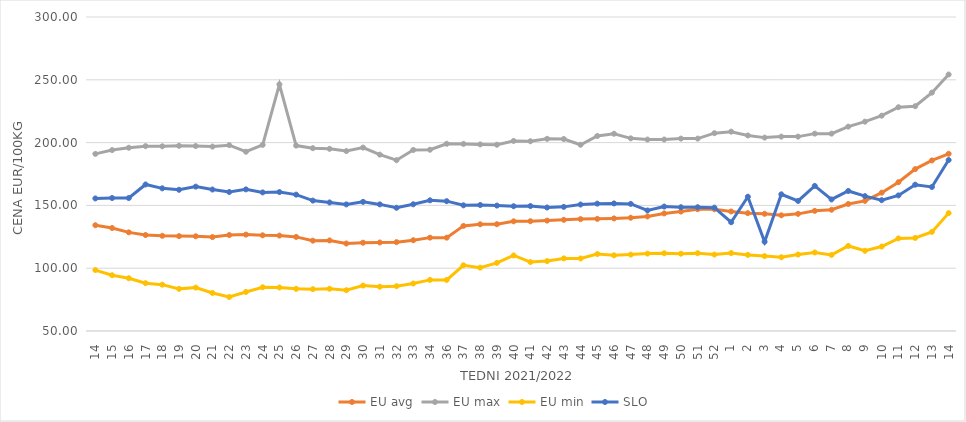
| Category | EU avg | EU max | EU min | SLO |
|---|---|---|---|---|
| 14.0 | 134.198 | 191.034 | 98.5 | 155.55 |
| 15.0 | 132.003 | 194.047 | 94.39 | 155.88 |
| 16.0 | 128.53 | 195.913 | 92.04 | 155.88 |
| 17.0 | 126.415 | 197.188 | 88.07 | 166.66 |
| 18.0 | 125.787 | 197.055 | 86.89 | 163.58 |
| 19.0 | 125.54 | 197.478 | 83.546 | 162.44 |
| 20.0 | 125.412 | 197.263 | 84.55 | 164.94 |
| 21.0 | 124.768 | 196.821 | 80.264 | 162.64 |
| 22.0 | 126.43 | 197.963 | 77.048 | 160.68 |
| 23.0 | 126.76 | 192.72 | 81.087 | 162.75 |
| 24.0 | 126.19 | 198.186 | 84.83 | 160.34 |
| 25.0 | 125.97 | 246.36 | 84.63 | 160.6 |
| 26.0 | 124.92 | 197.607 | 83.57 | 158.57 |
| 27.0 | 121.922 | 195.566 | 83.3 | 153.83 |
| 28.0 | 122.106 | 195.043 | 83.64 | 152.35 |
| 29.0 | 119.659 | 193.272 | 82.49 | 150.79 |
| 30.0 | 120.3 | 196.01 | 86.16 | 152.82 |
| 31.0 | 120.473 | 190.42 | 85.26 | 150.8 |
| 32.0 | 120.756 | 186 | 85.65 | 148.1 |
| 33.0 | 122.274 | 194.145 | 87.8 | 150.88 |
| 34.0 | 124.332 | 194.304 | 90.69 | 154.04 |
| 36.0 | 124.332 | 199.06 | 90.69 | 153.37 |
| 37.0 | 133.685 | 198.97 | 102.334 | 150.06 |
| 38.0 | 134.959 | 198.57 | 100.43 | 150.32 |
| 39.0 | 135.021 | 198.3 | 104.21 | 149.86 |
| 40.0 | 137.315 | 201.34 | 110.15 | 149.34 |
| 41.0 | 137.411 | 201.081 | 104.9 | 149.48 |
| 42.0 | 137.908 | 202.98 | 105.65 | 148.32 |
| 43.0 | 138.52 | 202.856 | 107.8 | 148.83 |
| 44.0 | 139.076 | 198.26 | 107.75 | 150.69 |
| 45.0 | 139.275 | 205.257 | 111.25 | 151.41 |
| 46.0 | 139.626 | 207.046 | 110.26 | 151.56 |
| 47.0 | 140.17 | 203.387 | 110.83 | 151.2 |
| 48.0 | 141.2 | 202.42 | 111.62 | 145.97 |
| 49.0 | 143.614 | 202.45 | 111.89 | 149.07 |
| 50.0 | 145.101 | 203.17 | 111.54 | 148.55 |
| 51.0 | 146.984 | 203.17 | 111.93 | 148.54 |
| 52.0 | 146.958 | 207.5 | 110.85 | 148.22 |
| 1.0 | 145.157 | 208.7 | 112.04 | 136.59 |
| 2.0 | 143.842 | 205.67 | 110.59 | 156.88 |
| 3.0 | 143.324 | 203.97 | 109.62 | 121.07 |
| 4.0 | 142.105 | 204.76 | 108.71 | 158.82 |
| 5.0 | 143.269 | 204.76 | 110.86 | 153.55 |
| 6.0 | 145.648 | 207.14 | 112.52 | 165.51 |
| 7.0 | 146.545 | 207.14 | 110.619 | 154.74 |
| 8.0 | 151.148 | 212.7 | 117.709 | 161.48 |
| 9.0 | 153.62 | 216.67 | 113.871 | 157.38 |
| 10.0 | 160.142 | 221.43 | 117.233 | 154.16 |
| 11.0 | 168.465 | 228.17 | 123.737 | 157.96 |
| 12.0 | 178.919 | 228.97 | 124.105 | 166.49 |
| 13.0 | 185.792 | 239.77 | 128.918 | 164.66 |
| 14.0 | 191.103 | 254.21 | 143.85 | 186.11 |